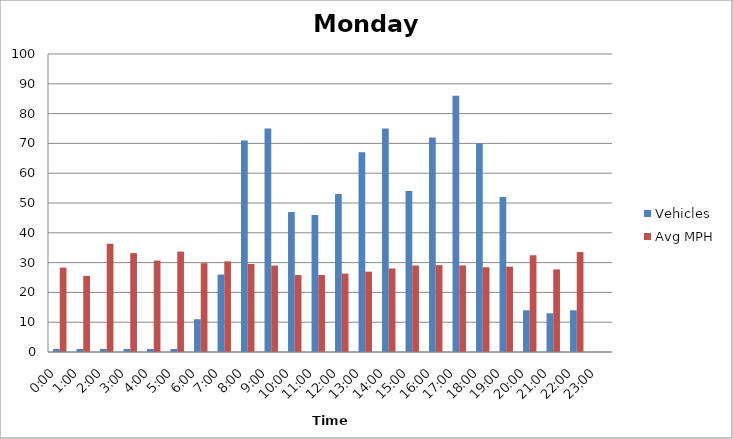
| Category | Vehicles | Avg MPH |
|---|---|---|
| 0:00 | 1 | 28.31 |
| 1:00 | 1 | 25.54 |
| 2:00 | 1 | 36.33 |
| 3:00 | 1 | 33.19 |
| 4:00 | 1 | 30.69 |
| 5:00 | 1 | 33.69 |
| 6:00 | 11 | 29.8 |
| 7:00 | 26 | 30.42 |
| 8:00 | 71 | 29.53 |
| 9:00 | 75 | 29.01 |
| 10:00 | 47 | 25.82 |
| 11:00 | 46 | 25.84 |
| 12:00 | 53 | 26.32 |
| 13:00 | 67 | 26.96 |
| 14:00 | 75 | 28.01 |
| 15:00 | 54 | 29.01 |
| 16:00 | 72 | 29.15 |
| 17:00 | 86 | 29.06 |
| 18:00 | 70 | 28.44 |
| 19:00 | 52 | 28.66 |
| 20:00 | 14 | 32.46 |
| 21:00 | 13 | 27.72 |
| 22:00 | 14 | 33.54 |
| 23:00 | 0 | 0 |